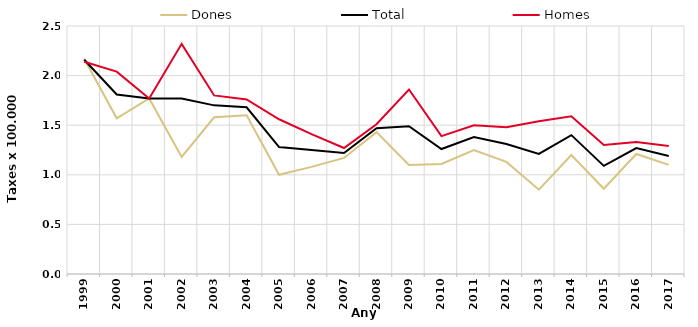
| Category | Dones | Total | Homes |
|---|---|---|---|
| 1999.0 | 2.17 | 2.16 | 2.14 |
| 2000.0 | 1.57 | 1.81 | 2.04 |
| 2001.0 | 1.77 | 1.77 | 1.77 |
| 2002.0 | 1.18 | 1.77 | 2.32 |
| 2003.0 | 1.58 | 1.7 | 1.8 |
| 2004.0 | 1.6 | 1.68 | 1.76 |
| 2005.0 | 1 | 1.28 | 1.56 |
| 2006.0 | 1.08 | 1.25 | 1.41 |
| 2007.0 | 1.17 | 1.22 | 1.27 |
| 2008.0 | 1.43 | 1.47 | 1.51 |
| 2009.0 | 1.1 | 1.49 | 1.86 |
| 2010.0 | 1.11 | 1.26 | 1.39 |
| 2011.0 | 1.25 | 1.38 | 1.5 |
| 2012.0 | 1.13 | 1.31 | 1.48 |
| 2013.0 | 0.85 | 1.21 | 1.54 |
| 2014.0 | 1.2 | 1.4 | 1.59 |
| 2015.0 | 0.86 | 1.09 | 1.3 |
| 2016.0 | 1.21 | 1.27 | 1.33 |
| 2017.0 | 1.1 | 1.19 | 1.29 |